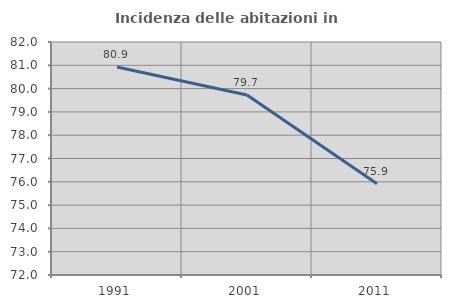
| Category | Incidenza delle abitazioni in proprietà  |
|---|---|
| 1991.0 | 80.93 |
| 2001.0 | 79.728 |
| 2011.0 | 75.919 |